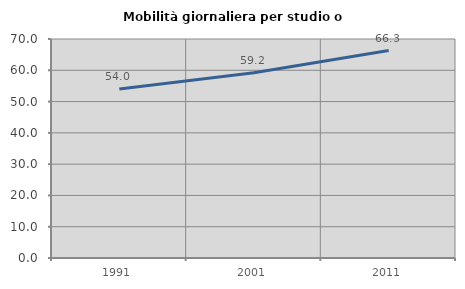
| Category | Mobilità giornaliera per studio o lavoro |
|---|---|
| 1991.0 | 53.997 |
| 2001.0 | 59.192 |
| 2011.0 | 66.314 |